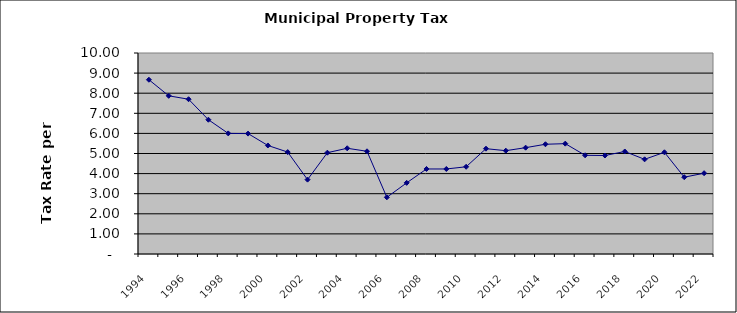
| Category | Rate |
|---|---|
| 1994.0 | 8.67 |
| 1995.0 | 7.87 |
| 1996.0 | 7.7 |
| 1997.0 | 6.68 |
| 1998.0 | 6 |
| 1999.0 | 5.99 |
| 2000.0 | 5.4 |
| 2001.0 | 5.07 |
| 2002.0 | 3.7 |
| 2003.0 | 5.04 |
| 2004.0 | 5.26 |
| 2005.0 | 5.11 |
| 2006.0 | 2.82 |
| 2007.0 | 3.54 |
| 2008.0 | 4.23 |
| 2009.0 | 4.23 |
| 2010.0 | 4.34 |
| 2011.0 | 5.24 |
| 2012.0 | 5.14 |
| 2013.0 | 5.29 |
| 2014.0 | 5.46 |
| 2015.0 | 5.49 |
| 2016.0 | 4.91 |
| 2017.0 | 4.9 |
| 2018.0 | 5.1 |
| 2019.0 | 4.71 |
| 2020.0 | 5.06 |
| 2021.0 | 3.82 |
| 2022.0 | 4.02 |